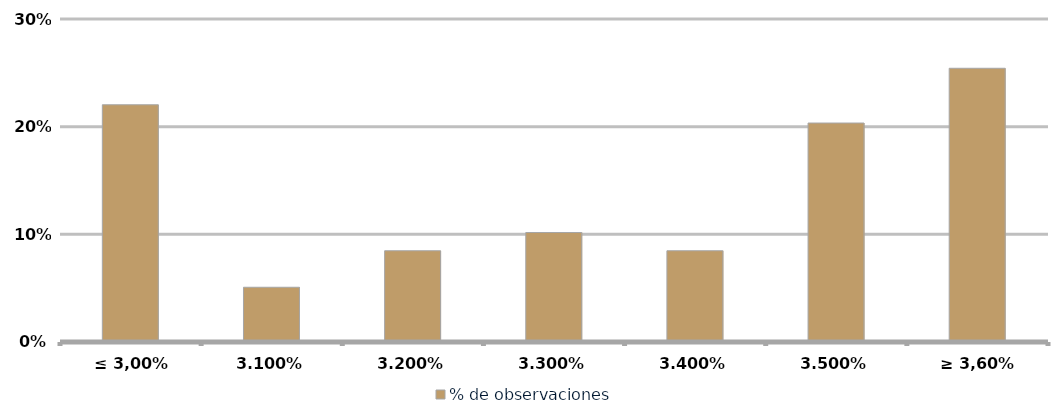
| Category | % de observaciones  |
|---|---|
| ≤ 3,00% | 0.22 |
| 3,10% | 0.051 |
| 3,20% | 0.085 |
| 3,30% | 0.102 |
| 3,40% | 0.085 |
| 3,50% | 0.203 |
| ≥ 3,60% | 0.254 |